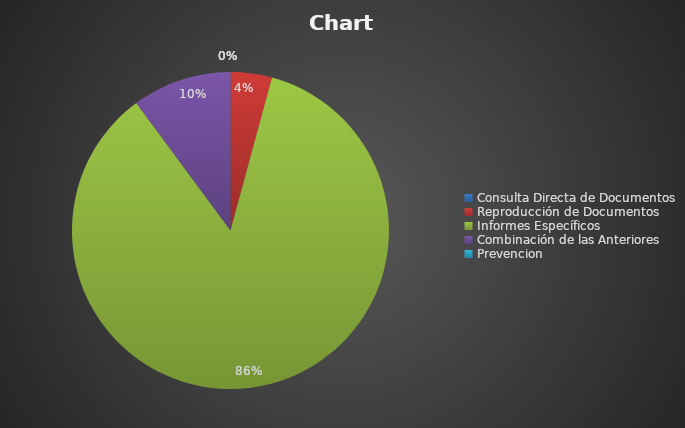
| Category | Series 0 |
|---|---|
| Consulta Directa de Documentos | 0 |
| Reproducción de Documentos | 10 |
| Informes Específicos | 203 |
| Combinación de las Anteriores | 24 |
| Prevencion | 0 |